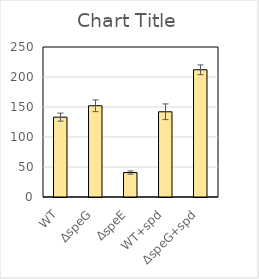
| Category | Series 0 |
|---|---|
| WT | 133.085 |
| ΔspeG | 152.046 |
| ΔspeE | 40.761 |
| WT+spd | 142.031 |
| ΔspeG+spd | 212.005 |